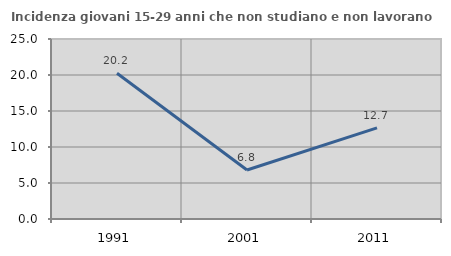
| Category | Incidenza giovani 15-29 anni che non studiano e non lavorano  |
|---|---|
| 1991.0 | 20.238 |
| 2001.0 | 6.808 |
| 2011.0 | 12.661 |